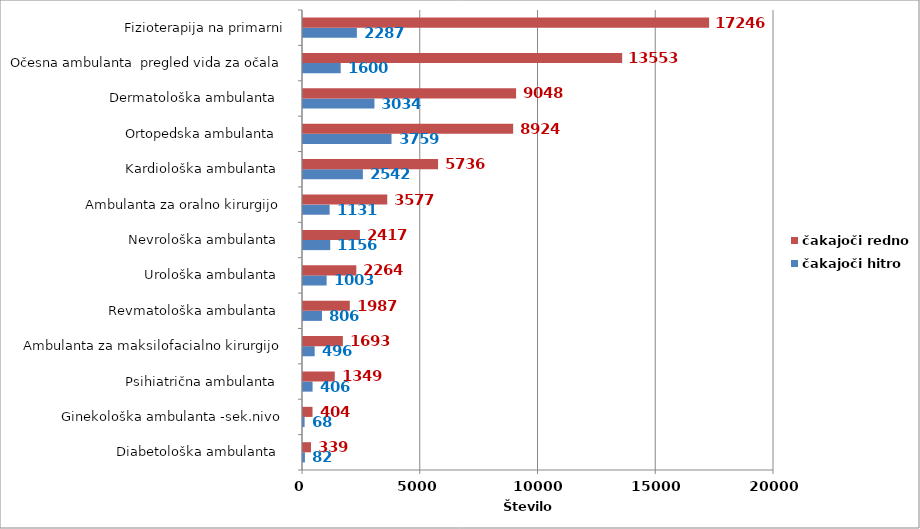
| Category | čakajoči hitro | čakajoči redno |
|---|---|---|
| Diabetološka ambulanta   | 82 | 339 |
| Ginekološka ambulanta -sek.nivo  | 68 | 404 |
| Psihiatrična ambulanta   | 406 | 1349 |
| Ambulanta za maksilofacialno kirurgijo  | 496 | 1693 |
| Revmatološka ambulanta   | 806 | 1987 |
| Urološka ambulanta   | 1003 | 2264 |
| Nevrološka ambulanta   | 1156 | 2417 |
| Ambulanta za oralno kirurgijo  | 1131 | 3577 |
| Kardiološka ambulanta   | 2542 | 5736 |
| Ortopedska ambulanta   | 3759 | 8924 |
| Dermatološka ambulanta   | 3034 | 9048 |
| Očesna ambulanta  pregled vida za očala | 1600 | 13553 |
| Fizioterapija na primarni | 2287 | 17246 |